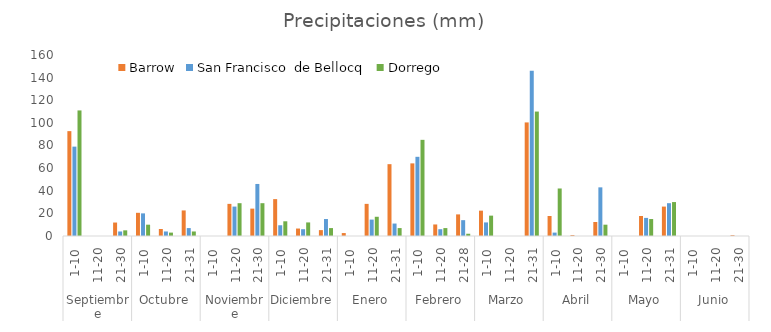
| Category | Barrow | San Francisco  | Dorrego |
|---|---|---|---|
| 0 | 92.7 | 79 | 111 |
| 1 | 0 | 0 | 0 |
| 2 | 11.9 | 4 | 5 |
| 3 | 20.5 | 20 | 10 |
| 4 | 6.2 | 4 | 3 |
| 5 | 22.6 | 7 | 4 |
| 6 | 0 | 0 | 0 |
| 7 | 28.4 | 26 | 29 |
| 8 | 24.2 | 46 | 29 |
| 9 | 32.6 | 9.5 | 13 |
| 10 | 6.6 | 6 | 12 |
| 11 | 5.2 | 15 | 7 |
| 12 | 2.6 | 0 | 0 |
| 13 | 28.4 | 14.5 | 17 |
| 14 | 63.5 | 11 | 7 |
| 15 | 64.2 | 70 | 85 |
| 16 | 10.2 | 6 | 7 |
| 17 | 19.1 | 14 | 2 |
| 18 | 22.4 | 12 | 18 |
| 19 | 0 | 0 | 0 |
| 20 | 100.4 | 146 | 110 |
| 21 | 17.7 | 3 | 42 |
| 22 | 0.8 | 0 | 0 |
| 23 | 12.4 | 43 | 10 |
| 24 | 0 | 0 | 0 |
| 25 | 17.7 | 16 | 15 |
| 26 | 26 | 29 | 30 |
| 27 | 0 | 0 | 0 |
| 28 | 0 | 0 | 0 |
| 29 | 0.7 | 0 | 0 |